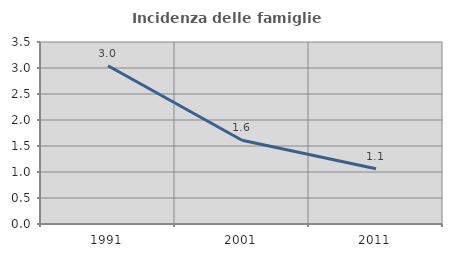
| Category | Incidenza delle famiglie numerose |
|---|---|
| 1991.0 | 3.043 |
| 2001.0 | 1.612 |
| 2011.0 | 1.061 |